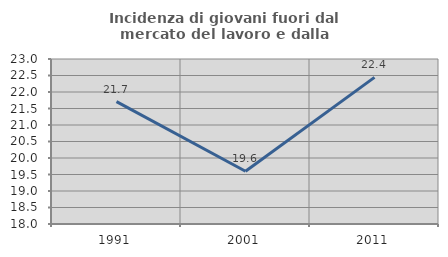
| Category | Incidenza di giovani fuori dal mercato del lavoro e dalla formazione  |
|---|---|
| 1991.0 | 21.71 |
| 2001.0 | 19.599 |
| 2011.0 | 22.442 |